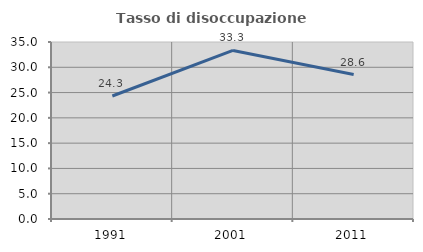
| Category | Tasso di disoccupazione giovanile  |
|---|---|
| 1991.0 | 24.324 |
| 2001.0 | 33.333 |
| 2011.0 | 28.571 |